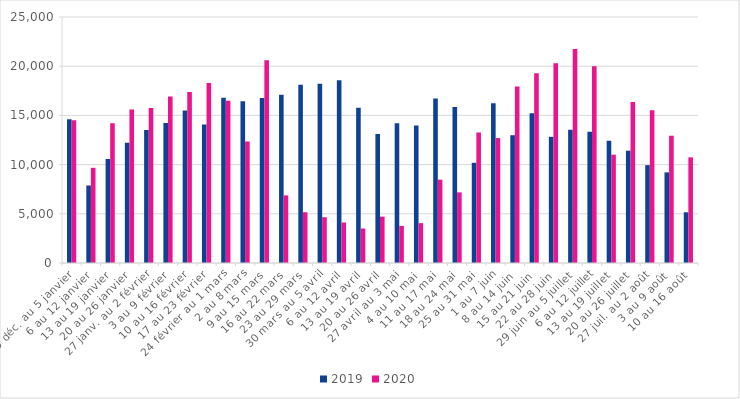
| Category | 2019 | 2020 |
|---|---|---|
| 30 déc. au 5 janvier | 14597 | 14500 |
| 6 au 12 janvier | 7879 | 9671 |
| 13 au 19 janvier | 10570 | 14214 |
| 20 au 26 janvier | 12222 | 15601 |
| 27 janv. au 2 février | 13510 | 15750 |
| 3 au 9 février | 14232 | 16921 |
| 10 au 16 février | 15499 | 17386 |
| 17 au 23 février | 14063 | 18299 |
| 24 février au 1 mars | 16783 | 16477 |
| 2 au 8 mars | 16432 | 12350 |
| 9 au 15 mars | 16765 | 20601 |
| 16 au 22 mars | 17107 | 6869 |
| 23 au 29 mars | 18126 | 5156 |
| 30 mars au 5 avril | 18204 | 4654 |
| 6 au 12 avril | 18560 | 4116 |
| 13 au 19 avril | 15788 | 3503 |
| 20 au 26 avril | 13099 | 4712 |
| 27 avril au 3 mai | 14207 | 3767 |
| 4 au 10 mai | 13969 | 4048 |
| 11 au 17 mai | 16713 | 8468 |
| 18 au 24 mai | 15841 | 7176 |
| 25 au 31 mai | 10184 | 13263 |
| 1 au 7 juin | 16246 | 12696 |
| 8 au 14 juin | 12988 | 17935 |
| 15 au 21 juin | 15214 | 19291 |
| 22 au 28 juin | 12823 | 20297 |
| 29 juin au 5 juillet | 13531 | 21756 |
| 6 au 12 juillet | 13339 | 19985 |
| 13 au 19 juillet | 12424 | 11008 |
| 20 au 26 juillet | 11414 | 16374 |
| 27 juil. au 2 août | 9944 | 15530 |
| 3 au 9 août | 9210 | 12933 |
| 10 au 16 août | 5155 | 10738 |